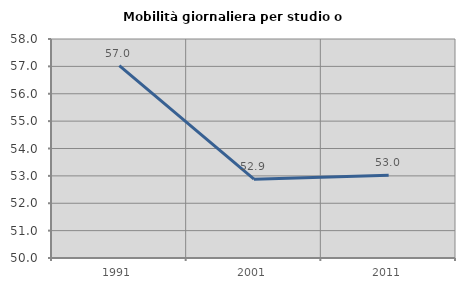
| Category | Mobilità giornaliera per studio o lavoro |
|---|---|
| 1991.0 | 57.024 |
| 2001.0 | 52.878 |
| 2011.0 | 53.02 |